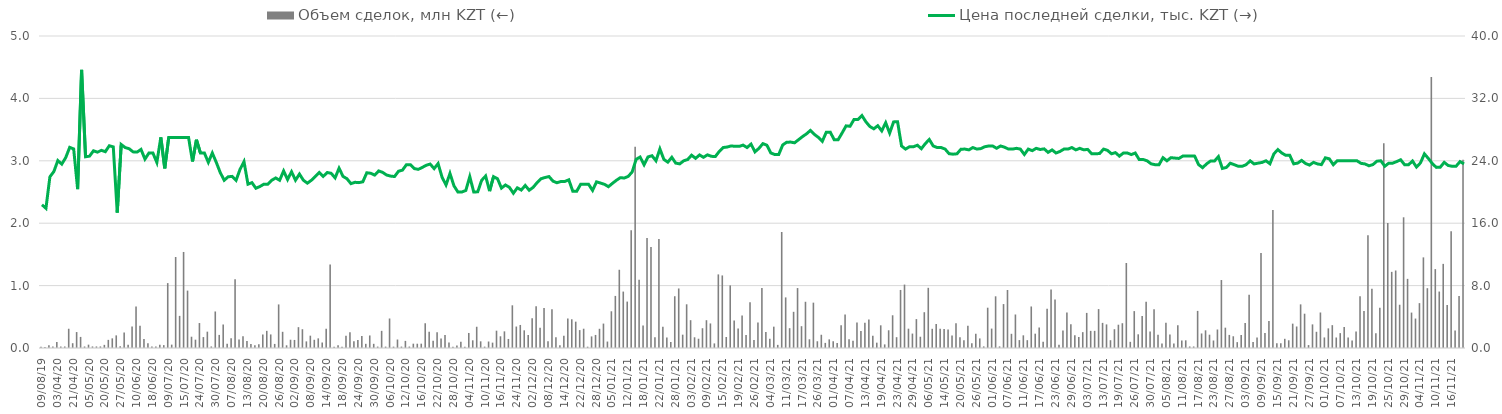
| Category | Объем сделок, млн KZT (←) |
|---|---|
| 2019-08-09 | 0.018 |
| 2019-08-12 | 0.018 |
| 2019-10-29 | 0.044 |
| 2020-02-26 | 0.023 |
| 2020-04-03 | 0.096 |
| 2020-04-06 | 0.024 |
| 2020-04-13 | 0.024 |
| 2020-04-20 | 0.309 |
| 2020-04-21 | 0.077 |
| 2020-04-28 | 0.256 |
| 2020-04-30 | 0.178 |
| 2020-05-04 | 0.025 |
| 2020-05-05 | 0.054 |
| 2020-05-06 | 0.025 |
| 2020-05-11 | 0.025 |
| 2020-05-15 | 0.025 |
| 2020-05-20 | 0.05 |
| 2020-05-21 | 0.13 |
| 2020-05-22 | 0.155 |
| 2020-05-26 | 0.202 |
| 2020-05-27 | 0.026 |
| 2020-06-01 | 0.249 |
| 2020-06-08 | 0.051 |
| 2020-06-09 | 0.346 |
| 2020-06-10 | 0.667 |
| 2020-06-11 | 0.355 |
| 2020-06-12 | 0.146 |
| 2020-06-17 | 0.075 |
| 2020-06-18 | 0.025 |
| 2020-06-25 | 0.024 |
| 2020-06-26 | 0.054 |
| 2020-07-01 | 0.046 |
| 2020-07-09 | 1.04 |
| 2020-07-10 | 0.054 |
| 2020-07-13 | 1.458 |
| 2020-07-14 | 0.515 |
| 2020-07-15 | 1.539 |
| 2020-07-16 | 0.92 |
| 2020-07-17 | 0.181 |
| 2020-07-21 | 0.133 |
| 2020-07-24 | 0.4 |
| 2020-07-27 | 0.175 |
| 2020-07-28 | 0.262 |
| 2020-07-29 | 0.025 |
| 2020-07-30 | 0.585 |
| 2020-08-04 | 0.21 |
| 2020-08-05 | 0.378 |
| 2020-08-06 | 0.066 |
| 2020-08-07 | 0.156 |
| 2020-08-10 | 1.1 |
| 2020-08-11 | 0.135 |
| 2020-08-12 | 0.188 |
| 2020-08-13 | 0.114 |
| 2020-08-14 | 0.064 |
| 2020-08-18 | 0.044 |
| 2020-08-19 | 0.062 |
| 2020-08-20 | 0.217 |
| 2020-08-21 | 0.275 |
| 2020-08-24 | 0.217 |
| 2020-08-25 | 0.065 |
| 2020-08-26 | 0.698 |
| 2020-08-27 | 0.26 |
| 2020-08-28 | 0.043 |
| 2020-09-01 | 0.132 |
| 2020-09-02 | 0.129 |
| 2020-09-03 | 0.334 |
| 2020-09-04 | 0.301 |
| 2020-09-07 | 0.106 |
| 2020-09-08 | 0.198 |
| 2020-09-09 | 0.132 |
| 2020-09-10 | 0.155 |
| 2020-09-11 | 0.088 |
| 2020-09-14 | 0.31 |
| 2020-09-15 | 1.339 |
| 2020-09-16 | 0.022 |
| 2020-09-17 | 0.046 |
| 2020-09-18 | 0.022 |
| 2020-09-21 | 0.195 |
| 2020-09-22 | 0.254 |
| 2020-09-23 | 0.106 |
| 2020-09-24 | 0.127 |
| 2020-09-25 | 0.191 |
| 2020-09-28 | 0.067 |
| 2020-09-29 | 0.201 |
| 2020-09-30 | 0.067 |
| 2020-10-01 | 0.023 |
| 2020-10-02 | 0.275 |
| 2020-10-05 | 0.022 |
| 2020-10-06 | 0.473 |
| 2020-10-07 | 0.022 |
| 2020-10-08 | 0.136 |
| 2020-10-09 | 0.023 |
| 2020-10-12 | 0.114 |
| 2020-10-13 | 0.024 |
| 2020-10-14 | 0.069 |
| 2020-10-15 | 0.069 |
| 2020-10-16 | 0.069 |
| 2020-10-19 | 0.397 |
| 2020-10-20 | 0.26 |
| 2020-10-21 | 0.115 |
| 2020-10-22 | 0.254 |
| 2020-10-23 | 0.154 |
| 2020-10-26 | 0.21 |
| 2020-10-27 | 0.089 |
| 2020-10-28 | 0.021 |
| 2020-10-29 | 0.04 |
| 2020-10-30 | 0.1 |
| 2020-11-02 | 0.02 |
| 2020-11-04 | 0.241 |
| 2020-11-05 | 0.123 |
| 2020-11-06 | 0.34 |
| 2020-11-09 | 0.107 |
| 2020-11-10 | 0.022 |
| 2020-11-11 | 0.104 |
| 2020-11-12 | 0.086 |
| 2020-11-13 | 0.278 |
| 2020-11-16 | 0.188 |
| 2020-11-18 | 0.267 |
| 2020-11-19 | 0.145 |
| 2020-11-23 | 0.684 |
| 2020-11-24 | 0.344 |
| 2020-11-25 | 0.369 |
| 2020-11-26 | 0.283 |
| 2020-11-30 | 0.207 |
| 2020-12-02 | 0.477 |
| 2020-12-03 | 0.67 |
| 2020-12-04 | 0.324 |
| 2020-12-07 | 0.639 |
| 2020-12-08 | 0.107 |
| 2020-12-09 | 0.623 |
| 2020-12-10 | 0.171 |
| 2020-12-11 | 0.043 |
| 2020-12-14 | 0.196 |
| 2020-12-15 | 0.472 |
| 2020-12-20 | 0.46 |
| 2020-12-21 | 0.422 |
| 2020-12-22 | 0.287 |
| 2020-12-23 | 0.309 |
| 2020-12-24 | 0.021 |
| 2020-12-25 | 0.186 |
| 2020-12-28 | 0.209 |
| 2020-12-29 | 0.308 |
| 2020-12-30 | 0.391 |
| 2020-12-31 | 0.103 |
| 2021-01-05 | 0.588 |
| 2021-01-06 | 0.835 |
| 2021-01-08 | 1.254 |
| 2021-01-11 | 0.904 |
| 2021-01-12 | 0.744 |
| 2021-01-13 | 1.889 |
| 2021-01-14 | 3.225 |
| 2021-01-15 | 1.094 |
| 2021-01-18 | 0.359 |
| 2021-01-19 | 1.764 |
| 2021-01-20 | 1.619 |
| 2021-01-21 | 0.172 |
| 2021-01-22 | 1.745 |
| 2021-01-25 | 0.341 |
| 2021-01-26 | 0.169 |
| 2021-01-27 | 0.096 |
| 2021-01-28 | 0.83 |
| 2021-01-29 | 0.954 |
| 2021-02-01 | 0.214 |
| 2021-02-02 | 0.7 |
| 2021-02-03 | 0.446 |
| 2021-02-04 | 0.172 |
| 2021-02-05 | 0.148 |
| 2021-02-08 | 0.317 |
| 2021-02-09 | 0.446 |
| 2021-02-10 | 0.394 |
| 2021-02-11 | 0.074 |
| 2021-02-12 | 1.179 |
| 2021-02-15 | 1.163 |
| 2021-02-16 | 0.176 |
| 2021-02-17 | 1.003 |
| 2021-02-18 | 0.439 |
| 2021-02-19 | 0.311 |
| 2021-02-22 | 0.521 |
| 2021-02-23 | 0.207 |
| 2021-02-25 | 0.733 |
| 2021-02-26 | 0.129 |
| 2021-03-01 | 0.409 |
| 2021-03-02 | 0.962 |
| 2021-03-03 | 0.258 |
| 2021-03-04 | 0.15 |
| 2021-03-05 | 0.342 |
| 2021-03-09 | 0.05 |
| 2021-03-10 | 1.859 |
| 2021-03-11 | 0.811 |
| 2021-03-12 | 0.318 |
| 2021-03-15 | 0.58 |
| 2021-03-16 | 0.961 |
| 2021-03-17 | 0.35 |
| 2021-03-18 | 0.741 |
| 2021-03-19 | 0.139 |
| 2021-03-25 | 0.727 |
| 2021-03-26 | 0.108 |
| 2021-03-29 | 0.212 |
| 2021-03-30 | 0.082 |
| 2021-03-31 | 0.138 |
| 2021-04-01 | 0.11 |
| 2021-04-02 | 0.081 |
| 2021-04-05 | 0.363 |
| 2021-04-06 | 0.536 |
| 2021-04-07 | 0.142 |
| 2021-04-08 | 0.117 |
| 2021-04-09 | 0.409 |
| 2021-04-12 | 0.273 |
| 2021-04-13 | 0.407 |
| 2021-04-14 | 0.457 |
| 2021-04-15 | 0.196 |
| 2021-04-16 | 0.086 |
| 2021-04-19 | 0.363 |
| 2021-04-20 | 0.058 |
| 2021-04-21 | 0.284 |
| 2021-04-22 | 0.524 |
| 2021-04-23 | 0.173 |
| 2021-04-26 | 0.93 |
| 2021-04-27 | 1.016 |
| 2021-04-28 | 0.31 |
| 2021-04-29 | 0.231 |
| 2021-04-30 | 0.463 |
| 2021-05-04 | 0.181 |
| 2021-05-05 | 0.574 |
| 2021-05-06 | 0.964 |
| 2021-05-11 | 0.308 |
| 2021-05-12 | 0.385 |
| 2021-05-13 | 0.307 |
| 2021-05-14 | 0.303 |
| 2021-05-17 | 0.298 |
| 2021-05-18 | 0.199 |
| 2021-05-19 | 0.396 |
| 2021-05-20 | 0.173 |
| 2021-05-21 | 0.125 |
| 2021-05-24 | 0.355 |
| 2021-05-25 | 0.077 |
| 2021-05-26 | 0.229 |
| 2021-05-27 | 0.153 |
| 2021-05-28 | 0.026 |
| 2021-05-31 | 0.646 |
| 2021-06-01 | 0.311 |
| 2021-06-02 | 0.828 |
| 2021-06-03 | 0.026 |
| 2021-06-04 | 0.704 |
| 2021-06-07 | 0.929 |
| 2021-06-08 | 0.227 |
| 2021-06-09 | 0.537 |
| 2021-06-10 | 0.127 |
| 2021-06-11 | 0.203 |
| 2021-06-14 | 0.125 |
| 2021-06-15 | 0.666 |
| 2021-06-16 | 0.23 |
| 2021-06-17 | 0.33 |
| 2021-06-18 | 0.102 |
| 2021-06-21 | 0.629 |
| 2021-06-22 | 0.939 |
| 2021-06-23 | 0.779 |
| 2021-06-24 | 0.05 |
| 2021-06-25 | 0.28 |
| 2021-06-28 | 0.571 |
| 2021-06-29 | 0.382 |
| 2021-06-30 | 0.204 |
| 2021-07-01 | 0.177 |
| 2021-07-02 | 0.254 |
| 2021-07-03 | 0.562 |
| 2021-07-07 | 0.275 |
| 2021-07-08 | 0.275 |
| 2021-07-09 | 0.624 |
| 2021-07-13 | 0.403 |
| 2021-07-14 | 0.378 |
| 2021-07-15 | 0.125 |
| 2021-07-16 | 0.301 |
| 2021-07-19 | 0.373 |
| 2021-07-21 | 0.397 |
| 2021-07-22 | 1.362 |
| 2021-07-23 | 0.099 |
| 2021-07-26 | 0.591 |
| 2021-07-27 | 0.219 |
| 2021-07-28 | 0.511 |
| 2021-07-29 | 0.742 |
| 2021-07-30 | 0.265 |
| 2021-08-02 | 0.621 |
| 2021-08-03 | 0.214 |
| 2021-08-04 | 0.072 |
| 2021-08-05 | 0.406 |
| 2021-08-06 | 0.217 |
| 2021-08-09 | 0.073 |
| 2021-08-10 | 0.364 |
| 2021-08-11 | 0.12 |
| 2021-08-12 | 0.123 |
| 2021-08-13 | 0.025 |
| 2021-08-16 | 0.025 |
| 2021-08-17 | 0.595 |
| 2021-08-18 | 0.233 |
| 2021-08-19 | 0.283 |
| 2021-08-20 | 0.213 |
| 2021-08-23 | 0.12 |
| 2021-08-24 | 0.296 |
| 2021-08-25 | 1.089 |
| 2021-08-26 | 0.326 |
| 2021-08-27 | 0.21 |
| 2021-08-31 | 0.188 |
| 2021-09-01 | 0.094 |
| 2021-09-02 | 0.21 |
| 2021-09-03 | 0.4 |
| 2021-09-06 | 0.853 |
| 2021-09-07 | 0.095 |
| 2021-09-08 | 0.167 |
| 2021-09-09 | 1.524 |
| 2021-09-10 | 0.242 |
| 2021-09-13 | 0.434 |
| 2021-09-14 | 2.213 |
| 2021-09-15 | 0.076 |
| 2021-09-16 | 0.075 |
| 2021-09-17 | 0.147 |
| 2021-09-20 | 0.124 |
| 2021-09-21 | 0.39 |
| 2021-09-22 | 0.345 |
| 2021-09-23 | 0.699 |
| 2021-09-24 | 0.55 |
| 2021-09-27 | 0.047 |
| 2021-09-28 | 0.379 |
| 2021-09-29 | 0.26 |
| 2021-09-30 | 0.569 |
| 2021-10-01 | 0.169 |
| 2021-10-04 | 0.315 |
| 2021-10-05 | 0.366 |
| 2021-10-06 | 0.168 |
| 2021-10-07 | 0.238 |
| 2021-10-08 | 0.336 |
| 2021-10-11 | 0.168 |
| 2021-10-12 | 0.12 |
| 2021-10-13 | 0.264 |
| 2021-10-14 | 0.828 |
| 2021-10-15 | 0.593 |
| 2021-10-18 | 1.808 |
| 2021-10-19 | 0.95 |
| 2021-10-20 | 0.238 |
| 2021-10-21 | 0.647 |
| 2021-10-22 | 3.28 |
| 2021-10-25 | 2.004 |
| 2021-10-26 | 1.22 |
| 2021-10-27 | 1.242 |
| 2021-10-28 | 0.693 |
| 2021-10-29 | 2.095 |
| 2021-11-01 | 1.108 |
| 2021-11-02 | 0.567 |
| 2021-11-03 | 0.472 |
| 2021-11-04 | 0.719 |
| 2021-11-05 | 1.452 |
| 2021-11-08 | 0.959 |
| 2021-11-09 | 4.343 |
| 2021-11-10 | 1.264 |
| 2021-11-11 | 0.905 |
| 2021-11-12 | 1.348 |
| 2021-11-15 | 0.688 |
| 2021-11-16 | 1.871 |
| 2021-11-17 | 0.28 |
| 2021-11-18 | 0.833 |
| 2021-11-19 | 3.017 |